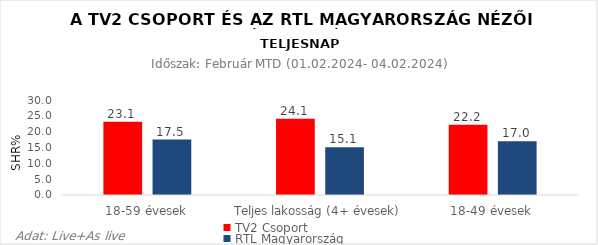
| Category | TV2 Csoport | RTL Magyarország |
|---|---|---|
| 18-59 évesek | 23.1 | 17.5 |
| Teljes lakosság (4+ évesek) | 24.1 | 15.1 |
| 18-49 évesek | 22.2 | 17 |